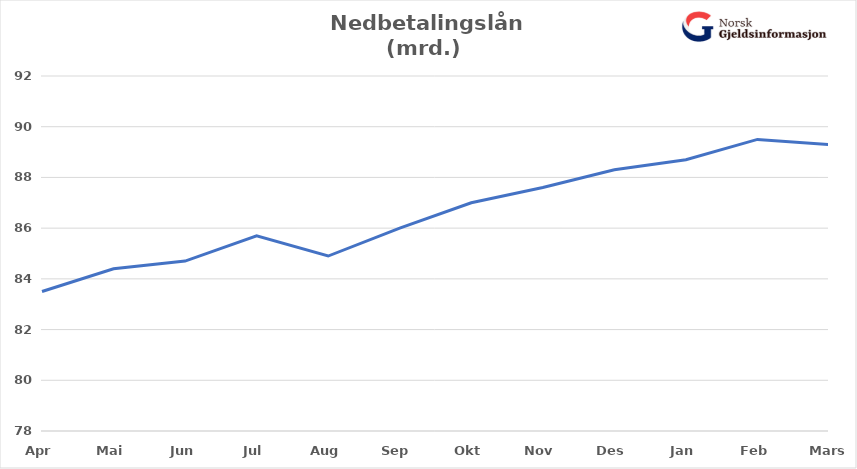
| Category | Nedbetalingslån |
|---|---|
| Apr | 83.5 |
| Mai | 84.4 |
| Jun | 84.7 |
| Jul | 85.7 |
| Aug | 84.9 |
| Sep | 86 |
| Okt | 87 |
| Nov | 87.6 |
| Des | 88.3 |
| Jan | 88.7 |
| Feb | 89.5 |
| Mars | 89.3 |